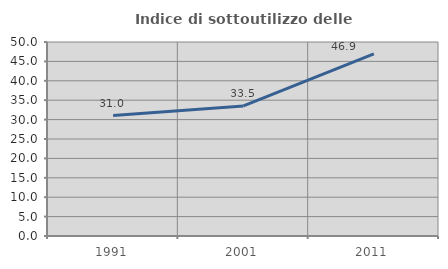
| Category | Indice di sottoutilizzo delle abitazioni  |
|---|---|
| 1991.0 | 31.046 |
| 2001.0 | 33.52 |
| 2011.0 | 46.935 |